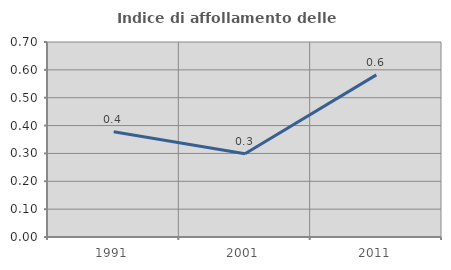
| Category | Indice di affollamento delle abitazioni  |
|---|---|
| 1991.0 | 0.378 |
| 2001.0 | 0.299 |
| 2011.0 | 0.582 |